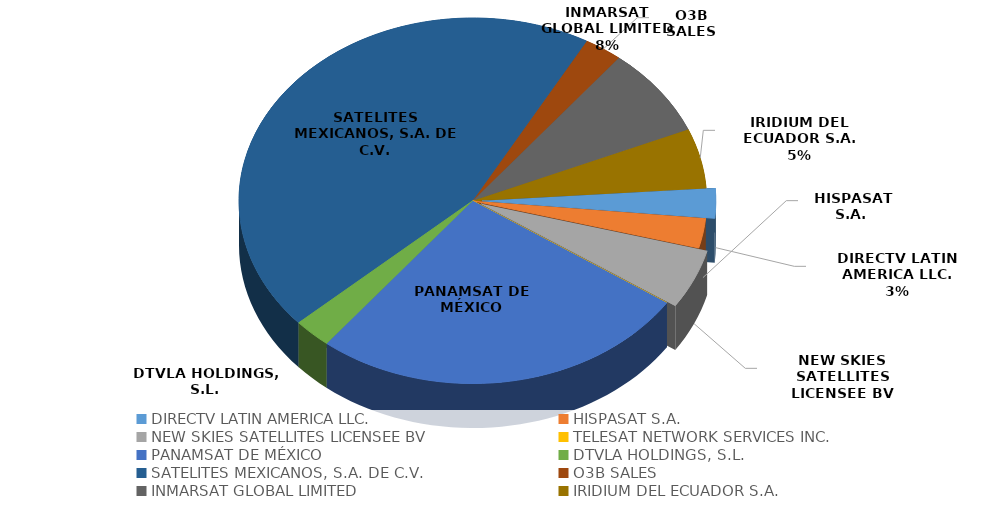
| Category | SERVICIO DE CAPACIDAD INTERNACIONAL MODALIDAD SEGMENTO ESPACIAL |
|---|---|
| DIRECTV LATIN AMERICA LLC. | 1 |
| HISPASAT S.A.  | 1 |
| NEW SKIES SATELLITES LICENSEE BV | 2 |
| TELESAT NETWORK SERVICES INC. | 0 |
| PANAMSAT DE MÉXICO | 10 |
| DTVLA HOLDINGS, S.L. | 1 |
| SATELITES MEXICANOS, S.A. DE C.V. | 17 |
| O3B SALES | 1 |
| INMARSAT GLOBAL LIMITED | 3 |
| IRIDIUM DEL ECUADOR S.A. | 2 |